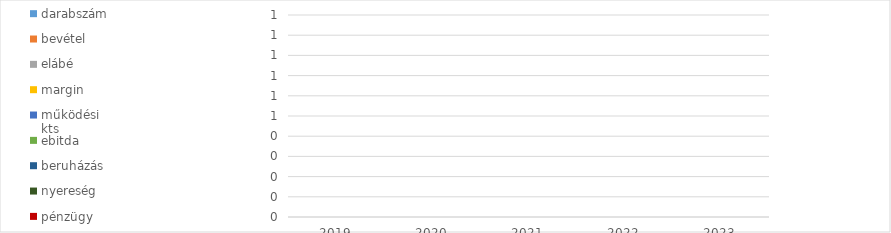
| Category | darabszám | bevétel | elábé | margin | működési kts | ebitda | beruházás | nyereség | pénzügy  | tőkésítve |
|---|---|---|---|---|---|---|---|---|---|---|
| 2019.0 | 0 | 0 | 0 | 0 | 0 | 0 | 0 | 0 | 0 | 0 |
| 2020.0 | 0 | 0 | 0 | 0 | 0 | 0 | 0 | 0 | 0 | 0 |
| 2021.0 | 0 | 0 | 0 | 0 | 0 | 0 | 0 | 0 | 0 | 0 |
| 2022.0 | 0 | 0 | 0 | 0 | 0 | 0 | 0 | 0 | 0 | 0 |
| 2023.0 | 0 | 0 | 0 | 0 | 0 | 0 | 0 | 0 | 0 | 0 |